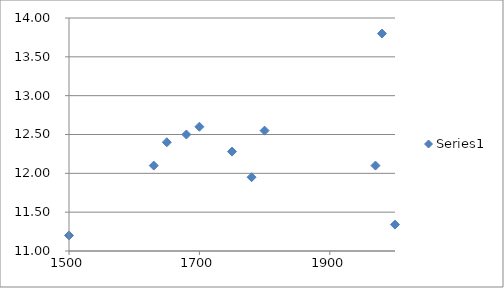
| Category | Series 0 |
|---|---|
| 1500.0 | 11.2 |
| 1630.0 | 12.1 |
| 1650.0 | 12.4 |
| 1680.0 | 12.5 |
| 1700.0 | 12.6 |
| 1750.0 | 12.28 |
| 1780.0 | 11.95 |
| 1800.0 | 12.55 |
| 1970.0 | 12.1 |
| 1980.0 | 13.8 |
| 2000.0 | 11.34 |